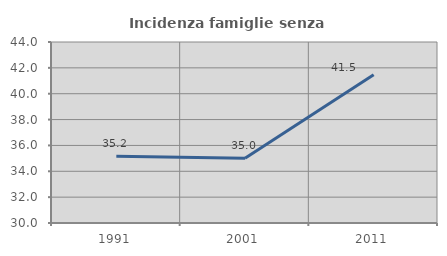
| Category | Incidenza famiglie senza nuclei |
|---|---|
| 1991.0 | 35.158 |
| 2001.0 | 35 |
| 2011.0 | 41.467 |